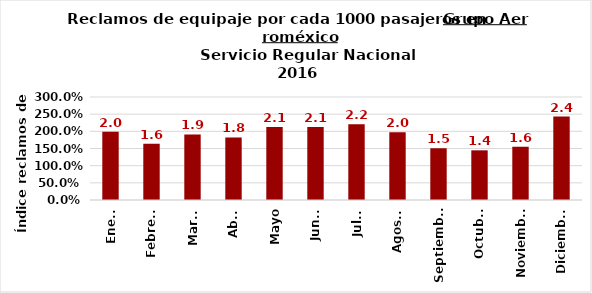
| Category | Reclamos por cada 1000 pasajeros |
|---|---|
| Enero | 1.988 |
| Febrero | 1.637 |
| Marzo | 1.91 |
| Abril | 1.824 |
| Mayo | 2.125 |
| Junio | 2.13 |
| Julio | 2.205 |
| Agosto | 1.974 |
| Septiembre | 1.509 |
| Octubre | 1.447 |
| Noviembre | 1.552 |
| Diciembre | 2.432 |